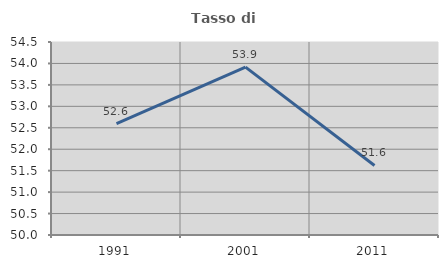
| Category | Tasso di occupazione   |
|---|---|
| 1991.0 | 52.599 |
| 2001.0 | 53.914 |
| 2011.0 | 51.622 |